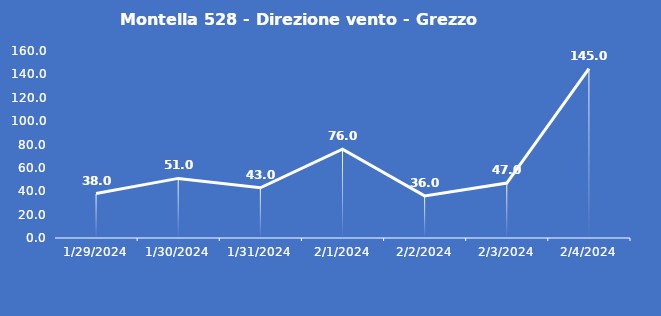
| Category | Montella 528 - Direzione vento - Grezzo (°N) |
|---|---|
| 1/29/24 | 38 |
| 1/30/24 | 51 |
| 1/31/24 | 43 |
| 2/1/24 | 76 |
| 2/2/24 | 36 |
| 2/3/24 | 47 |
| 2/4/24 | 145 |